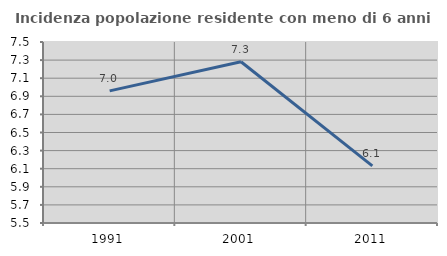
| Category | Incidenza popolazione residente con meno di 6 anni |
|---|---|
| 1991.0 | 6.96 |
| 2001.0 | 7.281 |
| 2011.0 | 6.131 |